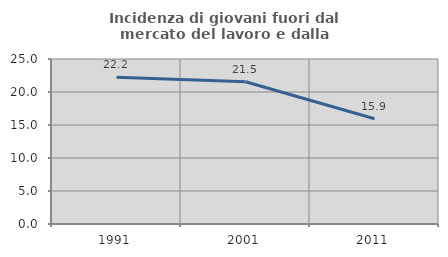
| Category | Incidenza di giovani fuori dal mercato del lavoro e dalla formazione  |
|---|---|
| 1991.0 | 22.222 |
| 2001.0 | 21.545 |
| 2011.0 | 15.944 |